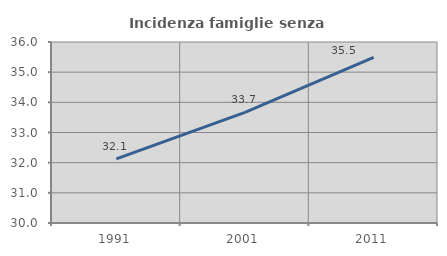
| Category | Incidenza famiglie senza nuclei |
|---|---|
| 1991.0 | 32.126 |
| 2001.0 | 33.667 |
| 2011.0 | 35.487 |